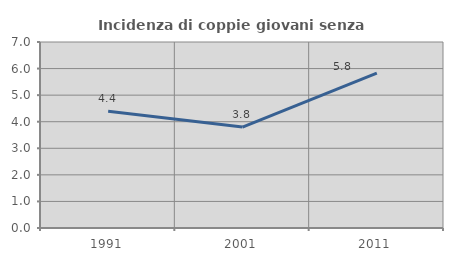
| Category | Incidenza di coppie giovani senza figli |
|---|---|
| 1991.0 | 4.396 |
| 2001.0 | 3.797 |
| 2011.0 | 5.831 |